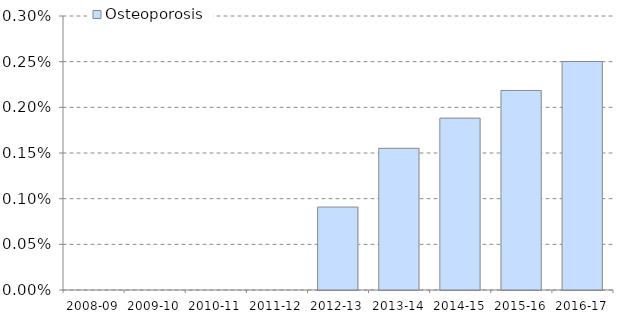
| Category | Osteoporosis |
|---|---|
| 2008-09 | 0 |
| 2009-10 | 0 |
| 2010-11 | 0 |
| 2011-12 | 0 |
| 2012-13 | 0.001 |
| 2013-14 | 0.002 |
| 2014-15 | 0.002 |
| 2015-16 | 0.002 |
| 2016-17 | 0.003 |